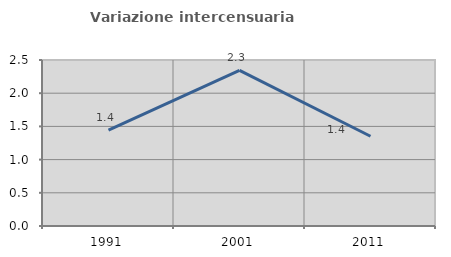
| Category | Variazione intercensuaria annua |
|---|---|
| 1991.0 | 1.445 |
| 2001.0 | 2.343 |
| 2011.0 | 1.352 |